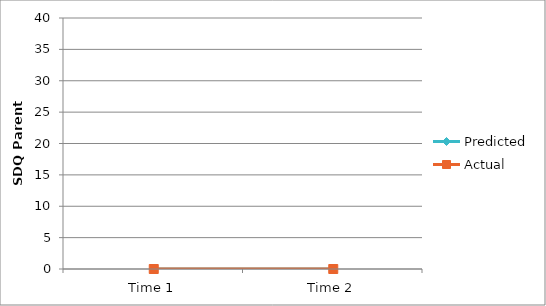
| Category | Predicted | Actual |
|---|---|---|
| Time 1 | 0 | 0 |
| Time 2 | 0 | 0 |